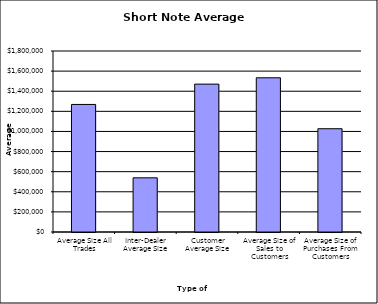
| Category | Security Type |
|---|---|
| Average Size All Trades | 1268488.023 |
| Inter-Dealer Average Size | 538770.193 |
| Customer Average Size | 1470678.938 |
| Average Size of Sales to Customers | 1533652.902 |
| Average Size of Purchases From Customers | 1026972.477 |